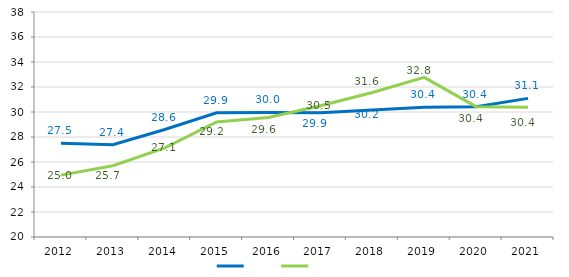
| Category | Series 1 | Series 0 |
|---|---|---|
| 2012 | 27.501 | 24.95 |
| 2013 | 27.39 | 25.703 |
| 2014 | 28.596 | 27.134 |
| 2015 | 29.942 | 29.206 |
| 2016 | 29.963 | 29.565 |
| 2017 | 29.947 | 30.496 |
| 2018 | 30.162 | 31.559 |
| 2019 | 30.383 | 32.774 |
| 2020 | 30.413 | 30.429 |
| 2021 | 31.091 | 30.38 |